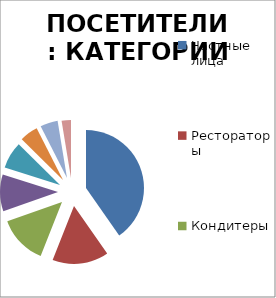
| Category | Visitor Countries |
|---|---|
| Частные лица | 0.403 |
| Рестораторы | 0.157 |
| Кондитеры | 0.136 |
| Руководители закупочных отделов торговых сетей | 0.103 |
| Руководители специализированных кондитерских магазинов | 0.075 |
| Руководители оптово-розничных торговых организаций | 0.051 |
| Директора свадебных салонов | 0.049 |
| Студенты кулинарных вузов | 0.026 |
|   | 0 |
|   | 0 |